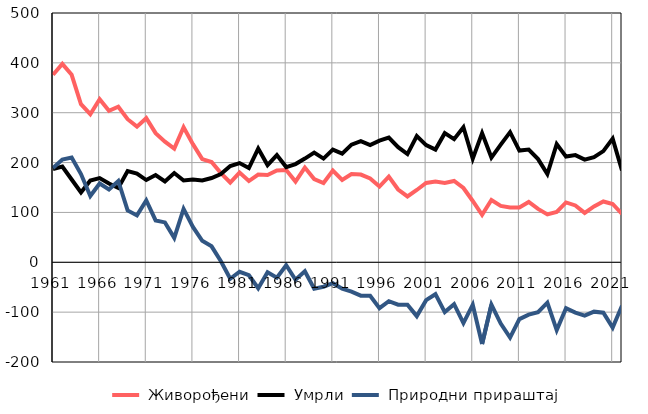
| Category |  Живорођени |  Умрли |  Природни прираштај |
|---|---|---|---|
| 1961.0 | 376 | 187 | 189 |
| 1962.0 | 398 | 192 | 206 |
| 1963.0 | 376 | 166 | 210 |
| 1964.0 | 317 | 140 | 177 |
| 1965.0 | 297 | 164 | 133 |
| 1966.0 | 327 | 169 | 158 |
| 1967.0 | 304 | 158 | 146 |
| 1968.0 | 312 | 149 | 163 |
| 1969.0 | 287 | 183 | 104 |
| 1970.0 | 272 | 178 | 94 |
| 1971.0 | 289 | 165 | 124 |
| 1972.0 | 259 | 175 | 84 |
| 1973.0 | 242 | 162 | 80 |
| 1974.0 | 228 | 179 | 49 |
| 1975.0 | 271 | 164 | 107 |
| 1976.0 | 237 | 166 | 71 |
| 1977.0 | 207 | 164 | 43 |
| 1978.0 | 201 | 169 | 32 |
| 1979.0 | 179 | 177 | 2 |
| 1980.0 | 160 | 193 | -33 |
| 1981.0 | 180 | 199 | -19 |
| 1982.0 | 163 | 189 | -26 |
| 1983.0 | 176 | 228 | -52 |
| 1984.0 | 175 | 195 | -20 |
| 1985.0 | 184 | 215 | -31 |
| 1986.0 | 185 | 191 | -6 |
| 1987.0 | 162 | 197 | -35 |
| 1988.0 | 190 | 208 | -18 |
| 1989.0 | 167 | 220 | -53 |
| 1990.0 | 159 | 208 | -49 |
| 1991.0 | 184 | 226 | -42 |
| 1992.0 | 165 | 218 | -53 |
| 1993.0 | 177 | 236 | -59 |
| 1994.0 | 176 | 243 | -67 |
| 1995.0 | 168 | 235 | -67 |
| 1996.0 | 152 | 244 | -92 |
| 1997.0 | 172 | 250 | -78 |
| 1998.0 | 146 | 231 | -85 |
| 1999.0 | 132 | 217 | -85 |
| 2000.0 | 145 | 253 | -108 |
| 2001.0 | 159 | 235 | -76 |
| 2002.0 | 162 | 226 | -64 |
| 2003.0 | 159 | 259 | -100 |
| 2004.0 | 163 | 247 | -84 |
| 2005.0 | 149 | 271 | -122 |
| 2006.0 | 123 | 208 | -85 |
| 2007.0 | 95 | 259 | -164 |
| 2008.0 | 125 | 210 | -85 |
| 2009.0 | 113 | 236 | -123 |
| 2010.0 | 110 | 261 | -151 |
| 2011.0 | 110 | 224 | -114 |
| 2012.0 | 121 | 226 | -105 |
| 2013.0 | 107 | 207 | -100 |
| 2014.0 | 96 | 177 | -81 |
| 2015.0 | 101 | 237 | -136 |
| 2016.0 | 120 | 212 | -92 |
| 2017.0 | 114 | 215 | -101 |
| 2018.0 | 99 | 206 | -107 |
| 2019.0 | 112 | 211 | -99 |
| 2020.0 | 122 | 223 | -101 |
| 2021.0 | 117 | 248 | -131 |
| 2022.0 | 97 | 184 | -87 |